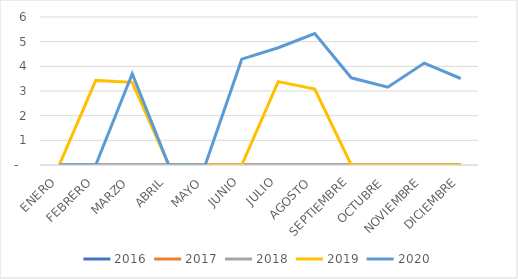
| Category | 2016 | 2017 | 2018 | 2019 | 2020 |
|---|---|---|---|---|---|
| ENERO | 0 | 0 | 0 | 0 | 0 |
| FEBRERO | 0 | 0 | 0 | 3.429 | 0 |
| MARZO | 0 | 0 | 0 | 3.351 | 3.699 |
| ABRIL | 0 | 0 | 0 | 0 | 0 |
| MAYO | 0 | 0 | 0 | 0 | 0 |
| JUNIO | 0 | 0 | 0 | 0 | 4.291 |
| JULIO | 0 | 0 | 0 | 3.379 | 4.754 |
| AGOSTO | 0 | 0 | 0 | 3.078 | 5.327 |
| SEPTIEMBRE | 0 | 0 | 0 | 0 | 3.535 |
| OCTUBRE | 0 | 0 | 0 | 0 | 3.152 |
| NOVIEMBRE | 0 | 0 | 0 | 0 | 4.131 |
| DICIEMBRE | 0 | 0 | 0 | 0 | 3.507 |